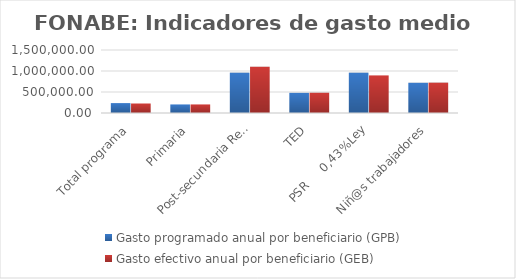
| Category | Gasto programado anual por beneficiario (GPB)  | Gasto efectivo anual por beneficiario (GEB)  |
|---|---|---|
| Total programa | 235836.516 | 226313.16 |
| Primaria | 204000 | 204056.396 |
| Post-secundaria Regular | 960000 | 1101392.502 |
| TED | 480000 | 482516.333 |
| PSR     0,43%Ley | 960000 | 895057.61 |
| Niñ@s trabajadores | 720000 | 722834.646 |